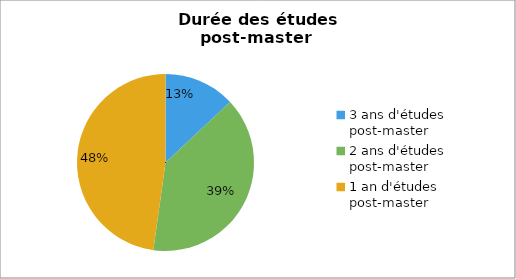
| Category | Promotion 2008 |
|---|---|
| 3 ans d'études post-master | 0.13 |
| 2 ans d'études post-master | 0.391 |
| 1 an d'études post-master | 0.477 |